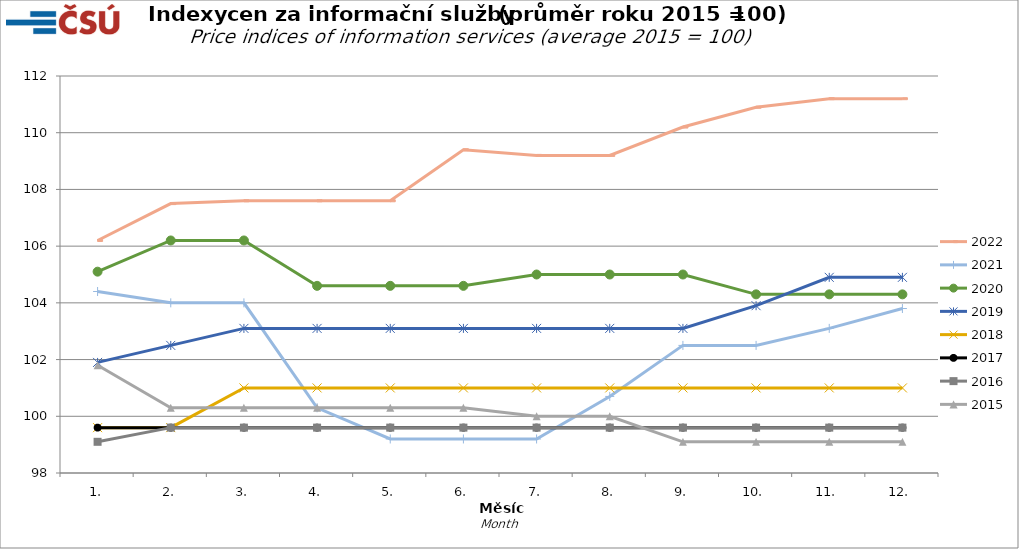
| Category | 2022 | 2021 | 2020 | 2019 | 2018 | 2017 | 2016 | 2015 |
|---|---|---|---|---|---|---|---|---|
| 1. | 106.2 | 104.4 | 105.1 | 101.9 | 99.6 | 99.6 | 99.1 | 101.8 |
| 2. | 107.5 | 104 | 106.2 | 102.5 | 99.6 | 99.6 | 99.6 | 100.3 |
| 3. | 107.6 | 104 | 106.2 | 103.1 | 101 | 99.6 | 99.6 | 100.3 |
| 4. | 107.6 | 100.3 | 104.6 | 103.1 | 101 | 99.6 | 99.6 | 100.3 |
| 5. | 107.6 | 99.2 | 104.6 | 103.1 | 101 | 99.6 | 99.6 | 100.3 |
| 6. | 109.4 | 99.2 | 104.6 | 103.1 | 101 | 99.6 | 99.6 | 100.3 |
| 7. | 109.2 | 99.2 | 105 | 103.1 | 101 | 99.6 | 99.6 | 100 |
| 8. | 109.2 | 100.7 | 105 | 103.1 | 101 | 99.6 | 99.6 | 100 |
| 9. | 110.2 | 102.5 | 105 | 103.1 | 101 | 99.6 | 99.6 | 99.1 |
| 10. | 110.9 | 102.5 | 104.3 | 103.9 | 101 | 99.6 | 99.6 | 99.1 |
| 11. | 111.2 | 103.1 | 104.3 | 104.9 | 101 | 99.6 | 99.6 | 99.1 |
| 12. | 111.2 | 103.8 | 104.3 | 104.9 | 101 | 99.6 | 99.6 | 99.1 |